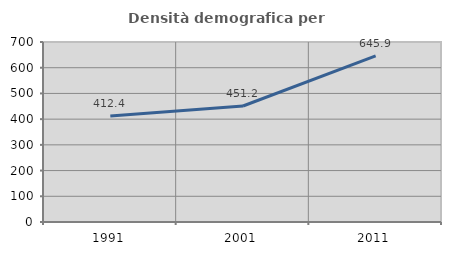
| Category | Densità demografica |
|---|---|
| 1991.0 | 412.394 |
| 2001.0 | 451.181 |
| 2011.0 | 645.897 |